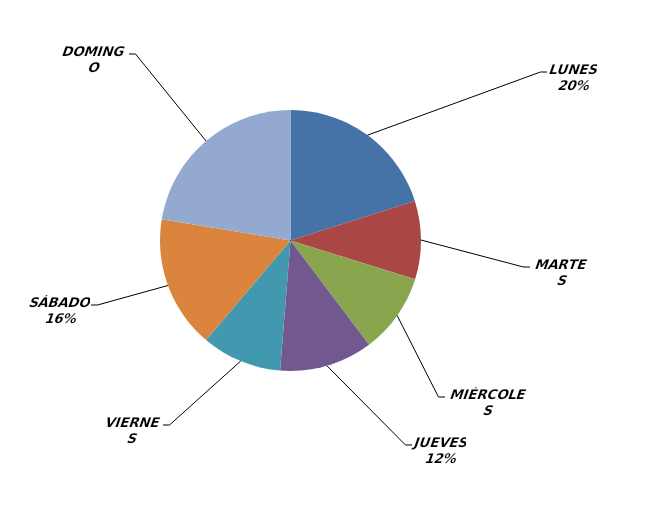
| Category | Series 0 |
|---|---|
| LUNES | 87 |
| MARTES | 42 |
| MIÉRCOLES | 43 |
| JUEVES | 50 |
| VIERNES | 43 |
| SÁBADO | 71 |
| DOMINGO | 97 |